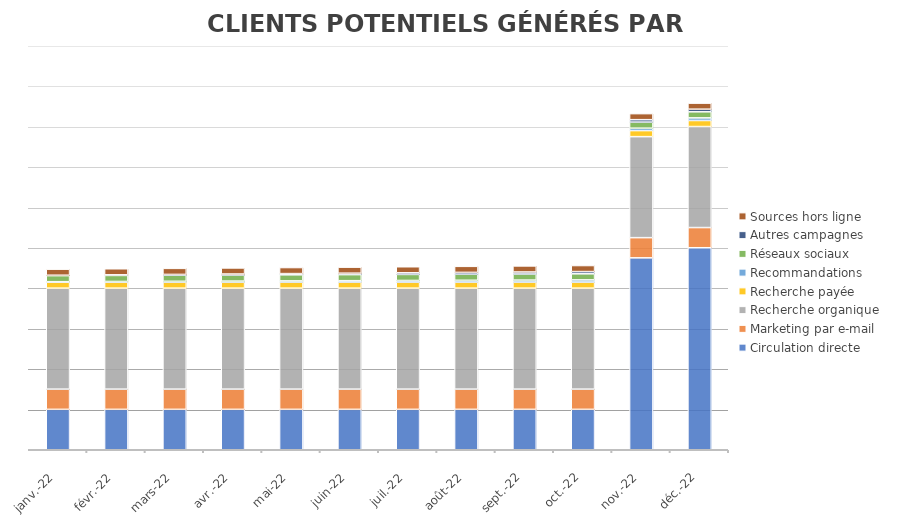
| Category | Circulation directe | Marketing par e-mail | Recherche organique | Recherche payée | Recommandations | Réseaux sociaux | Autres campagnes | Sources hors ligne |
|---|---|---|---|---|---|---|---|---|
| 2022-01-18 | 200 | 100 | 500 | 30 | 2 | 30 | 2 | 30 |
| 2022-02-18 | 200 | 100 | 500 | 30 | 3 | 30 | 3 | 30 |
| 2022-03-18 | 200 | 100 | 500 | 30 | 4 | 30 | 4 | 30 |
| 2022-04-18 | 200 | 100 | 500 | 30 | 5 | 30 | 5 | 30 |
| 2022-05-18 | 200 | 100 | 500 | 30 | 6 | 30 | 6 | 30 |
| 2022-06-18 | 200 | 100 | 500 | 30 | 7 | 30 | 7 | 30 |
| 2022-07-18 | 200 | 100 | 500 | 30 | 8 | 30 | 8 | 30 |
| 2022-08-18 | 200 | 100 | 500 | 30 | 9 | 30 | 9 | 30 |
| 2022-09-18 | 200 | 100 | 500 | 30 | 10 | 30 | 10 | 30 |
| 2022-10-18 | 200 | 100 | 500 | 30 | 11 | 30 | 11 | 30 |
| 2022-11-18 | 950 | 100 | 500 | 30 | 12 | 30 | 12 | 30 |
| 2022-12-18 | 1000 | 100 | 500 | 30 | 13 | 30 | 13 | 30 |